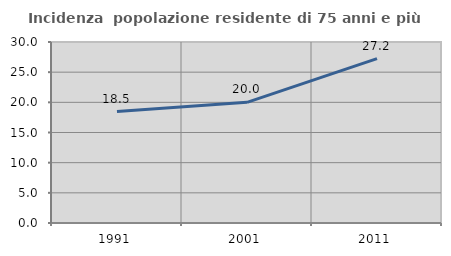
| Category | Incidenza  popolazione residente di 75 anni e più |
|---|---|
| 1991.0 | 18.464 |
| 2001.0 | 20 |
| 2011.0 | 27.241 |